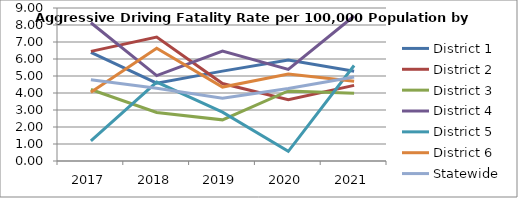
| Category | District 1 | District 2 | District 3 | District 4 | District 5 | District 6 | Statewide |
|---|---|---|---|---|---|---|---|
| 2017.0 | 6.387 | 6.45 | 4.204 | 8.134 | 1.178 | 4.051 | 4.776 |
| 2018.0 | 4.579 | 7.294 | 2.851 | 5.023 | 4.639 | 6.634 | 4.275 |
| 2019.0 | 5.288 | 4.555 | 2.42 | 6.467 | 2.874 | 4.35 | 3.693 |
| 2020.0 | 5.942 | 3.601 | 4.122 | 5.392 | 0.569 | 5.116 | 4.269 |
| 2021.0 | 5.275 | 4.448 | 3.985 | 8.531 | 5.617 | 4.689 | 4.945 |